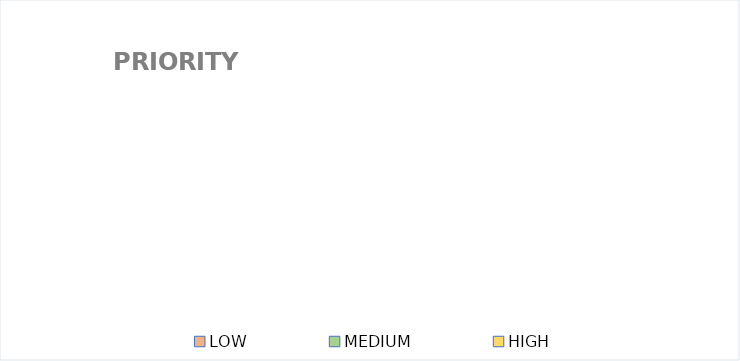
| Category | Series 0 |
|---|---|
| LOW | 0 |
| MEDIUM | 0 |
| HIGH | 0 |